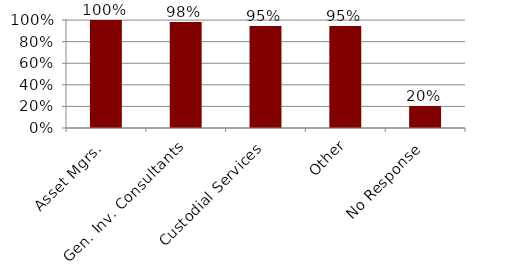
| Category | Series 0 |
|---|---|
| Asset Mgrs. | 1 |
| Gen. Inv. Consultants | 0.982 |
| Custodial Services | 0.945 |
| Other | 0.945 |
| No Response | 0.203 |